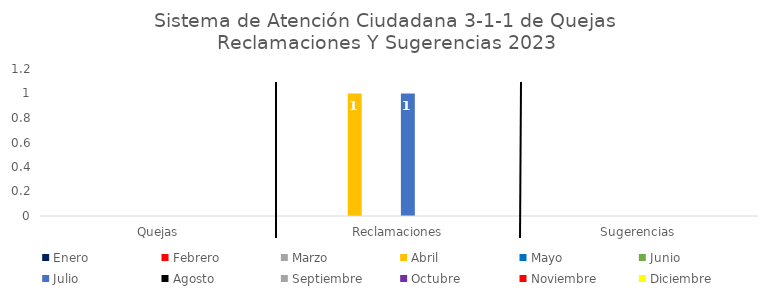
| Category | Enero | Febrero | Marzo | Abril | Mayo | Junio | Julio | Agosto | Septiembre | Octubre | Noviembre | Diciembre |
|---|---|---|---|---|---|---|---|---|---|---|---|---|
| Quejas | 0 | 0 | 0 | 0 | 0 | 0 | 0 | 0 | 0 | 0 | 0 | 0 |
| Reclamaciones | 0 | 0 | 0 | 1 | 0 | 0 | 1 | 0 | 0 | 0 | 0 | 0 |
| Sugerencias | 0 | 0 | 0 | 0 | 0 | 0 | 0 | 0 | 0 | 0 | 0 | 0 |